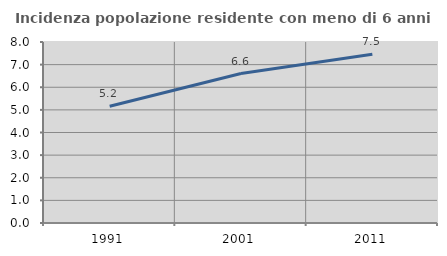
| Category | Incidenza popolazione residente con meno di 6 anni |
|---|---|
| 1991.0 | 5.157 |
| 2001.0 | 6.605 |
| 2011.0 | 7.46 |